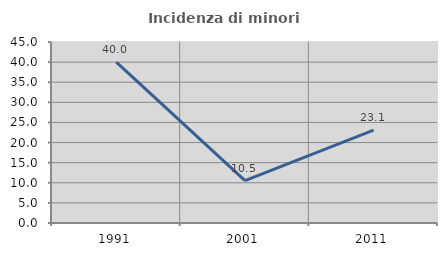
| Category | Incidenza di minori stranieri |
|---|---|
| 1991.0 | 40 |
| 2001.0 | 10.526 |
| 2011.0 | 23.077 |